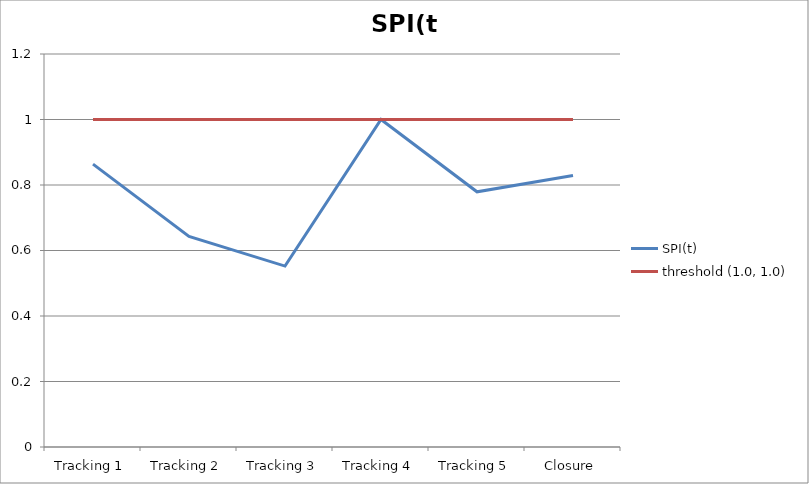
| Category | SPI(t) | threshold (1.0, 1.0) |
|---|---|---|
| Tracking 1 | 0.864 | 1 |
| Tracking 2 | 0.643 | 1 |
| Tracking 3 | 0.552 | 1 |
| Tracking 4 | 1 | 1 |
| Tracking 5 | 0.779 | 1 |
| Closure | 0.829 | 1 |